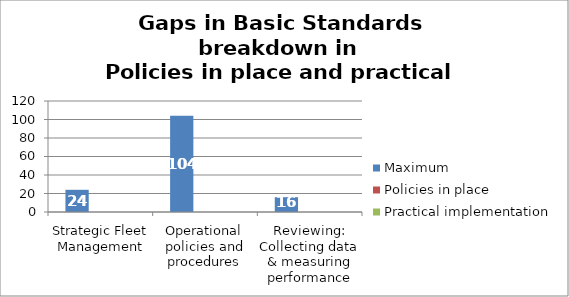
| Category | Maximum | Policies in place | Practical implementation |
|---|---|---|---|
| Strategic Fleet Management | 24 | 0 | 0 |
| Operational policies and procedures | 104 | 0 | 0 |
| Reviewing: Collecting data & measuring performance | 16 | 0 | 0 |